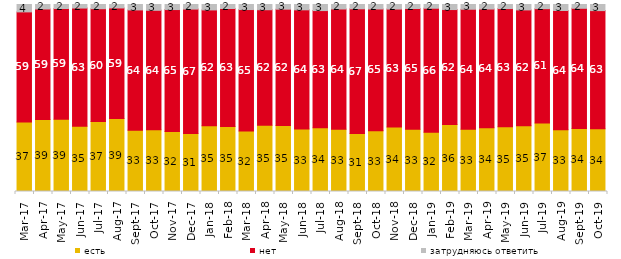
| Category | есть | нет | затрудняюсь ответить |
|---|---|---|---|
| 2017-03-01 | 37.2 | 58.85 | 3.95 |
| 2017-04-01 | 38.5 | 59.1 | 2.4 |
| 2017-05-01 | 38.7 | 59.15 | 2.15 |
| 2017-06-01 | 34.95 | 63.15 | 1.9 |
| 2017-07-01 | 37.4 | 60.35 | 2.25 |
| 2017-08-01 | 39 | 59.15 | 1.85 |
| 2017-09-01 | 32.8 | 64.3 | 2.9 |
| 2017-10-01 | 33 | 63.9 | 3.1 |
| 2017-11-01 | 32.1 | 65.15 | 2.7 |
| 2017-12-01 | 30.95 | 66.6 | 2.45 |
| 2018-01-01 | 35.2 | 61.9 | 2.9 |
| 2018-02-01 | 34.8 | 63.05 | 2.15 |
| 2018-03-01 | 32.35 | 64.95 | 2.7 |
| 2018-04-01 | 35.45 | 61.75 | 2.8 |
| 2018-05-01 | 35.3 | 62.15 | 2.5 |
| 2018-06-01 | 33.45 | 63.7 | 2.85 |
| 2018-07-01 | 34.05 | 62.7 | 3.25 |
| 2018-08-01 | 33.3 | 64.3 | 2.4 |
| 2018-09-01 | 31 | 66.7 | 2.3 |
| 2018-10-01 | 32.55 | 65.05 | 2.4 |
| 2018-11-01 | 34.431 | 63.124 | 2.445 |
| 2018-12-01 | 33.25 | 64.6 | 2.15 |
| 2019-01-01 | 31.75 | 66.25 | 2 |
| 2019-02-01 | 35.8 | 61.5 | 2.7 |
| 2019-03-01 | 33.317 | 64.147 | 2.536 |
| 2019-04-01 | 34.059 | 63.515 | 2.426 |
| 2019-05-01 | 34.621 | 63.2 | 2.179 |
| 2019-06-01 | 35.162 | 61.945 | 2.893 |
| 2019-07-01 | 36.634 | 61.139 | 2.228 |
| 2019-08-01 | 33.067 | 63.736 | 3.197 |
| 2019-09-01 | 33.713 | 64.257 | 2.03 |
| 2019-10-01 | 33.564 | 63.168 | 3.267 |